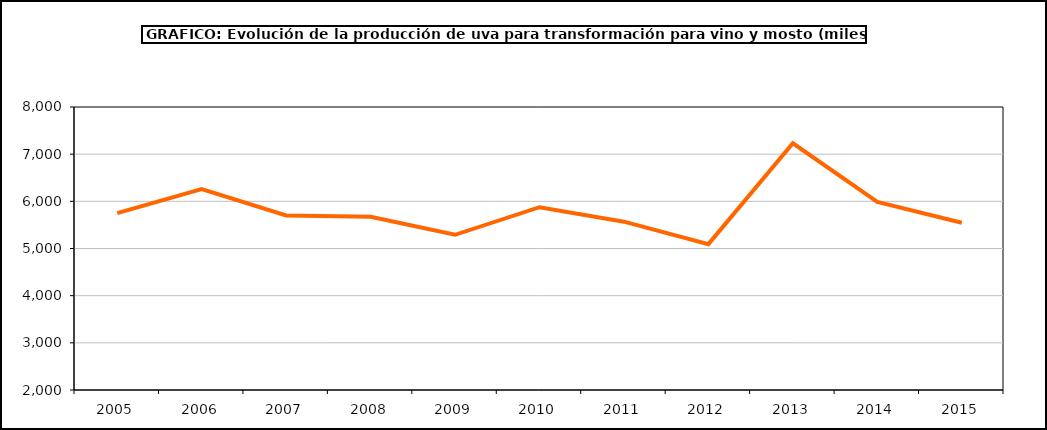
| Category | producción |
|---|---|
| 2005.0 | 5750.174 |
| 2006.0 | 6259.058 |
| 2007.0 | 5698.942 |
| 2008.0 | 5672.472 |
| 2009.0 | 5290.597 |
| 2010.0 | 5875.65 |
| 2011.0 | 5569.073 |
| 2012.0 | 5092.752 |
| 2013.0 | 7230.832 |
| 2014.0 | 5989.046 |
| 2015.0 | 5547.235 |